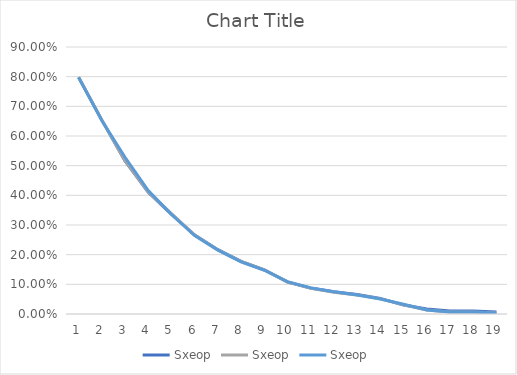
| Category | Sxeop |
|---|---|
| 0 | 0.798 |
| 1 | 0.652 |
| 2 | 0.528 |
| 3 | 0.416 |
| 4 | 0.336 |
| 5 | 0.264 |
| 6 | 0.215 |
| 7 | 0.176 |
| 8 | 0.148 |
| 9 | 0.109 |
| 10 | 0.088 |
| 11 | 0.075 |
| 12 | 0.064 |
| 13 | 0.051 |
| 14 | 0.033 |
| 15 | 0.014 |
| 16 | 0.007 |
| 17 | 0.007 |
| 18 | 0.003 |